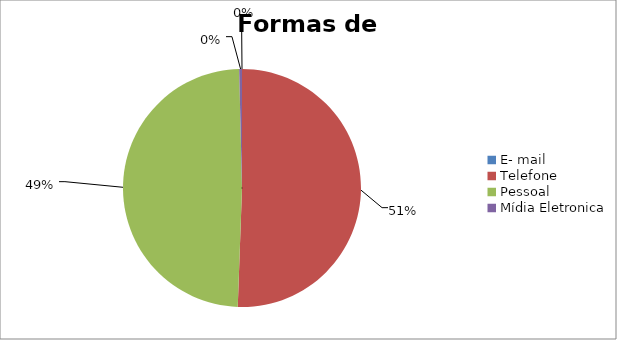
| Category | Series 0 |
|---|---|
| E- mail | 0 |
| Telefone | 0.506 |
| Pessoal | 0.49 |
| Mídia Eletronica | 0.004 |